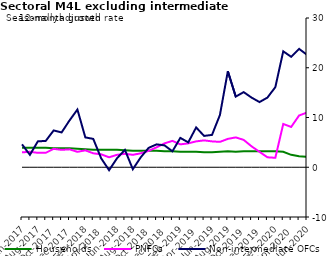
| Category | zero | Households | PNFCs | Non-intermediate OFCs |
|---|---|---|---|---|
| Jun-2017 | 0 | 3.9 | 3 | 4.6 |
| Jul-2017 | 0 | 3.9 | 3.1 | 2.5 |
| Aug-2017 | 0 | 3.9 | 2.9 | 5.2 |
| Sep-2017 | 0 | 3.9 | 2.9 | 5.3 |
| Oct-2017 | 0 | 3.8 | 3.7 | 7.4 |
| Nov-2017 | 0 | 3.8 | 3.5 | 7 |
| Dec-2017 | 0 | 3.8 | 3.6 | 9.4 |
| Jan-2018 | 0 | 3.7 | 3.1 | 11.6 |
| Feb-2018 | 0 | 3.6 | 3.4 | 6 |
| Mar-2018 | 0 | 3.5 | 2.8 | 5.7 |
| Apr-2018 | 0 | 3.5 | 2.6 | 1.8 |
| May-2018 | 0 | 3.5 | 2 | -0.6 |
| Jun-2018 | 0 | 3.5 | 2.5 | 1.8 |
| Jul-2018 | 0 | 3.4 | 2.7 | 3.5 |
| Aug-2018 | 0 | 3.3 | 2.5 | -0.4 |
| Sep-2018 | 0 | 3.3 | 2.8 | 2 |
| Oct-2018 | 0 | 3.3 | 3.3 | 3.9 |
| Nov-2018 | 0 | 3.3 | 4 | 4.6 |
| Dec-2018 | 0 | 3.2 | 4.8 | 4.4 |
| Jan-2019 | 0 | 3.2 | 5.3 | 3.2 |
| Feb-2019 | 0 | 3.1 | 4.6 | 5.9 |
| Mar-2019 | 0 | 3.1 | 4.8 | 5 |
| Apr-2019 | 0 | 3.1 | 5.2 | 8 |
| May-2019 | 0 | 3 | 5.4 | 6.3 |
| Jun-2019 | 0 | 3 | 5.2 | 6.5 |
| Jul-2019 | 0 | 3.1 | 5.1 | 10.5 |
| Aug-2019 | 0 | 3.2 | 5.7 | 19.3 |
| Sep-2019 | 0 | 3.1 | 6 | 14.2 |
| Oct-2019 | 0 | 3.2 | 5.5 | 15.1 |
| Nov-2019 | 0 | 3.2 | 4.2 | 14 |
| Dec-2019 | 0 | 3.2 | 3.1 | 13.1 |
| Jan-2020 | 0 | 3.2 | 2 | 14 |
| Feb-2020 | 0 | 3.2 | 1.9 | 16.1 |
| Mar-2020 | 0 | 3.1 | 8.7 | 23.3 |
| Apr-2020 | 0 | 2.5 | 8.1 | 22.2 |
| May-2020 | 0 | 2.2 | 10.4 | 23.8 |
| Jun-2020 | 0 | 2.1 | 11 | 22.6 |